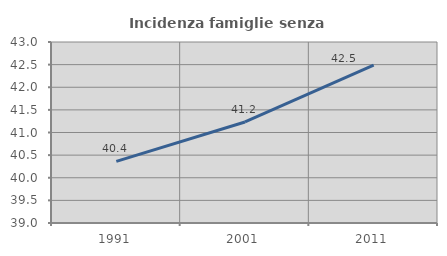
| Category | Incidenza famiglie senza nuclei |
|---|---|
| 1991.0 | 40.363 |
| 2001.0 | 41.232 |
| 2011.0 | 42.488 |